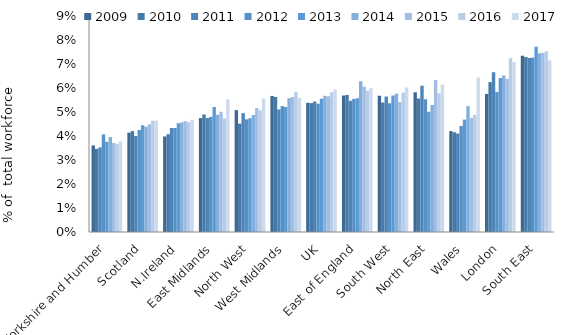
| Category | 2009 | 2010 | 2011 | 2012 | 2013 | 2014 | 2015 | 2016 | 2017 |
|---|---|---|---|---|---|---|---|---|---|
| Yorkshire and Humber | 0.036 | 0.035 | 0.035 | 0.041 | 0.038 | 0.04 | 0.037 | 0.037 | 0.038 |
| Scotland | 0.041 | 0.042 | 0.04 | 0.042 | 0.044 | 0.044 | 0.045 | 0.046 | 0.046 |
| N.Ireland | 0.04 | 0.041 | 0.043 | 0.043 | 0.045 | 0.046 | 0.046 | 0.046 | 0.047 |
| East Midlands | 0.047 | 0.049 | 0.048 | 0.048 | 0.052 | 0.049 | 0.05 | 0.047 | 0.055 |
| North West | 0.051 | 0.045 | 0.05 | 0.047 | 0.047 | 0.049 | 0.052 | 0.051 | 0.056 |
| West Midlands | 0.057 | 0.056 | 0.051 | 0.052 | 0.052 | 0.056 | 0.056 | 0.058 | 0.056 |
| UK | 0.054 | 0.054 | 0.054 | 0.053 | 0.056 | 0.057 | 0.057 | 0.058 | 0.059 |
| East of England | 0.057 | 0.057 | 0.055 | 0.055 | 0.056 | 0.063 | 0.061 | 0.059 | 0.06 |
| South West | 0.057 | 0.054 | 0.056 | 0.054 | 0.057 | 0.058 | 0.054 | 0.058 | 0.06 |
| North East | 0.058 | 0.056 | 0.061 | 0.055 | 0.05 | 0.053 | 0.063 | 0.058 | 0.061 |
| Wales | 0.042 | 0.042 | 0.041 | 0.044 | 0.047 | 0.052 | 0.047 | 0.049 | 0.064 |
| London | 0.058 | 0.062 | 0.067 | 0.058 | 0.064 | 0.065 | 0.064 | 0.072 | 0.071 |
| South East | 0.073 | 0.073 | 0.072 | 0.073 | 0.077 | 0.074 | 0.075 | 0.075 | 0.072 |